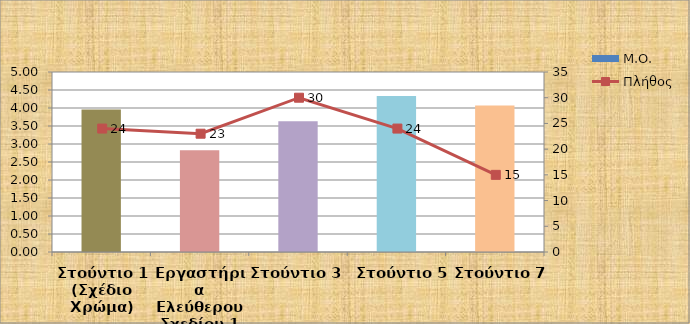
| Category | Μ.Ο. |
|---|---|
| Στούντιο 1 (Σχέδιο Χρώμα) | 3.958 |
| Εργαστήρια Ελεύθερου Σχεδίου 1 | 2.826 |
| Στούντιο 3  | 3.633 |
| Στούντιο 5 | 4.333 |
| Στούντιο 7 | 4.067 |